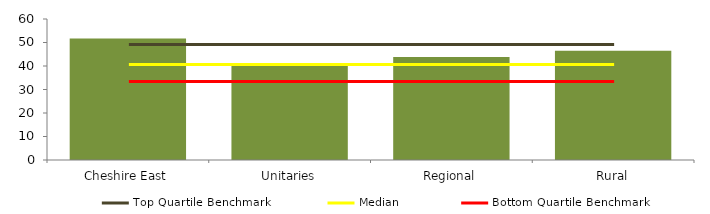
| Category | Block Data |
|---|---|
| Cheshire East | 51.7 |
| Unitaries | 41.11 |
| Regional | 43.8 |
|  Rural  | 46.525 |